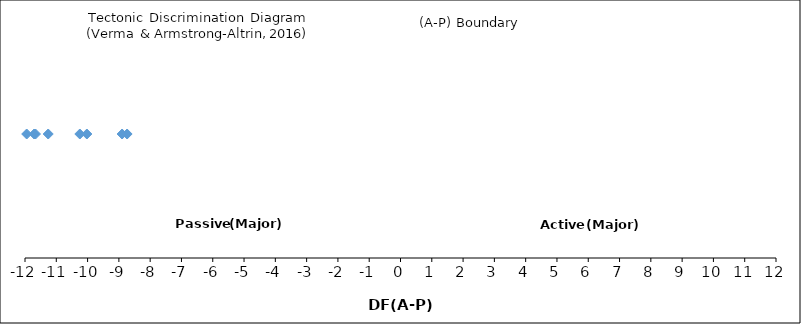
| Category | Series 0 |
|---|---|
| -16.74604311610505 | 1 |
| -12.112334847462357 | 1 |
| -11.706794508436804 | 1 |
| -14.700355888634892 | 1 |
| -8.735854595838616 | 1 |
| -11.257847187984511 | 1 |
| -8.897029854237456 | 1 |
| -11.94541642244782 | 1 |
| -12.214322794037905 | 1 |
| -10.023302383548781 | 1 |
| -12.203731331532081 | 1 |
| -10.248563547575387 | 1 |
| -11.66448117757059 | 1 |
| -12.52390115210282 | 1 |
| -16.7373909391532 | 1 |
| -12.181496777585808 | 1 |